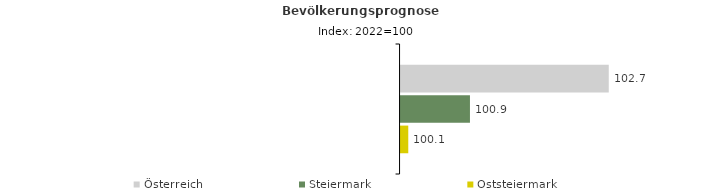
| Category | Österreich | Steiermark | Oststeiermark |
|---|---|---|---|
| 2022.0 | 102.7 | 100.9 | 100.1 |